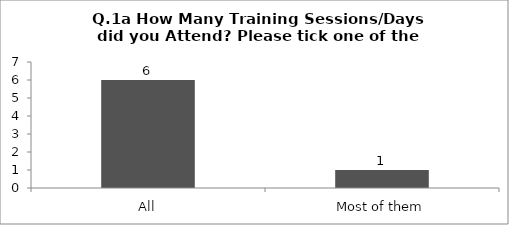
| Category | Q.1a How Many Training Sessions/Days did you Attend? Please tick one of the answers below |
|---|---|
| All | 6 |
| Most of them | 1 |